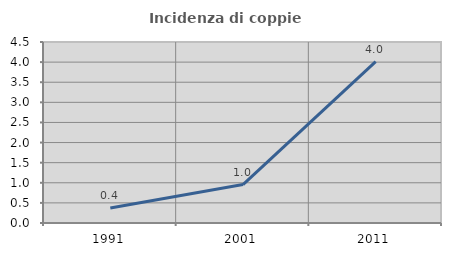
| Category | Incidenza di coppie miste |
|---|---|
| 1991.0 | 0.375 |
| 2001.0 | 0.955 |
| 2011.0 | 4.011 |